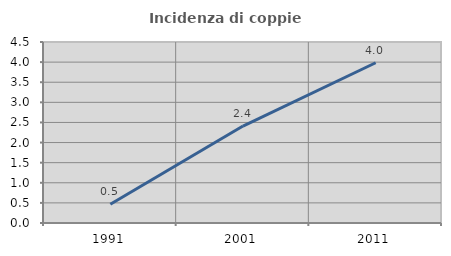
| Category | Incidenza di coppie miste |
|---|---|
| 1991.0 | 0.467 |
| 2001.0 | 2.41 |
| 2011.0 | 3.984 |